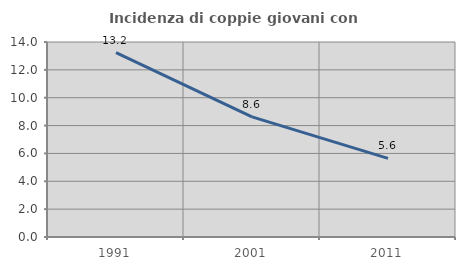
| Category | Incidenza di coppie giovani con figli |
|---|---|
| 1991.0 | 13.239 |
| 2001.0 | 8.624 |
| 2011.0 | 5.646 |